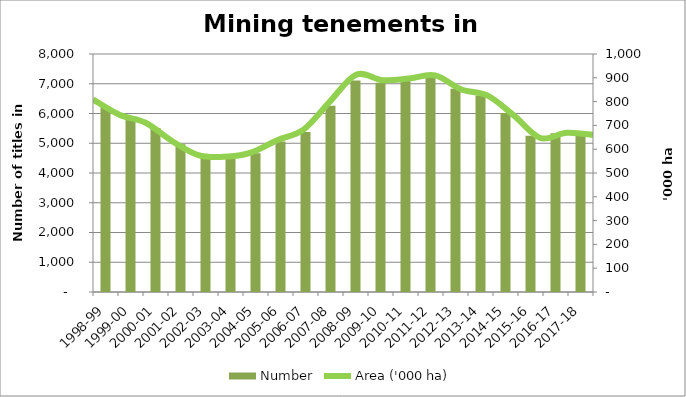
| Category | Number |
|---|---|
| 1998-99 | 6242 |
| 1999-00 | 5827 |
| 2000-01 | 5512 |
| 2001-02 | 4964 |
| 2002-03 | 4566 |
| 2003-04 | 4561 |
| 2004-05 | 4665 |
| 2005-06 | 5056 |
| 2006-07 | 5376 |
| 2007-08 | 6260 |
| 2008-09 | 7110 |
| 2009-10 | 7032 |
| 2010-11 | 7106 |
| 2011-12 | 7265 |
| 2012-13 | 6834 |
| 2013-14 | 6605 |
| 2014-15 | 6018 |
| 2015-16 | 5252 |
| 2016-17 | 5335 |
| 2017-18 | 5257 |